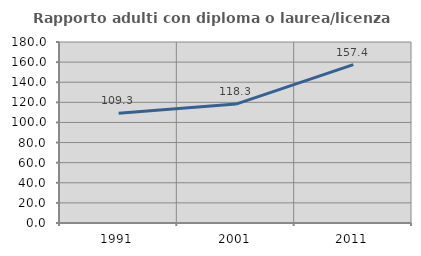
| Category | Rapporto adulti con diploma o laurea/licenza media  |
|---|---|
| 1991.0 | 109.259 |
| 2001.0 | 118.28 |
| 2011.0 | 157.447 |